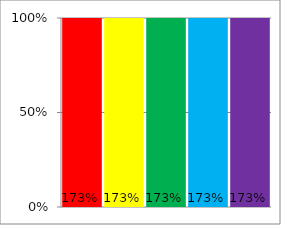
| Category | Series 0 |
|---|---|
| 0 | 1.731 |
| 1 | 1.731 |
| 2 | 1.731 |
| 3 | 1.731 |
| 4 | 1.731 |